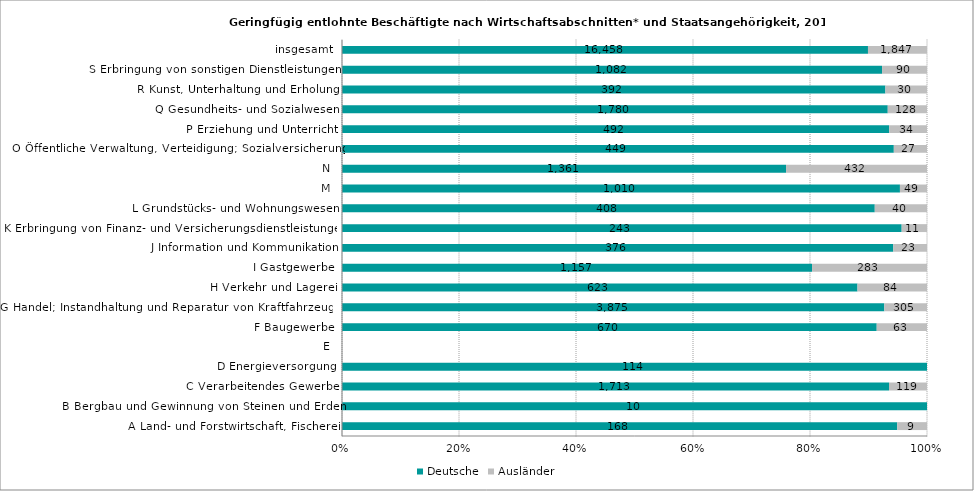
| Category | Deutsche | Ausländer |
|---|---|---|
| A Land- und Forstwirtschaft, Fischerei | 168 | 9 |
| B Bergbau und Gewinnung von Steinen und Erden | 10 | 0 |
| C Verarbeitendes Gewerbe | 1713 | 119 |
| D Energieversorgung | 114 | 0 |
| E | 0 | 0 |
| F Baugewerbe | 670 | 63 |
| G Handel; Instandhaltung und Reparatur von Kraftfahrzeugen | 3875 | 305 |
| H Verkehr und Lagerei | 623 | 84 |
| I Gastgewerbe | 1157 | 283 |
| J Information und Kommunikation | 376 | 23 |
| K Erbringung von Finanz- und Versicherungsdienstleistungen | 243 | 11 |
| L Grundstücks- und Wohnungswesen | 408 | 40 |
| M | 1010 | 49 |
| N | 1361 | 432 |
| O Öffentliche Verwaltung, Verteidigung; Sozialversicherung | 449 | 27 |
| P Erziehung und Unterricht | 492 | 34 |
| Q Gesundheits- und Sozialwesen | 1780 | 128 |
| R Kunst, Unterhaltung und Erholung | 392 | 30 |
| S Erbringung von sonstigen Dienstleistungen | 1082 | 90 |
| insgesamt | 16458 | 1847 |